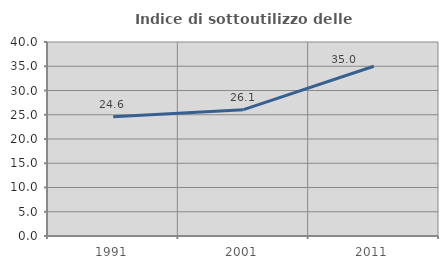
| Category | Indice di sottoutilizzo delle abitazioni  |
|---|---|
| 1991.0 | 24.576 |
| 2001.0 | 26.05 |
| 2011.0 | 35 |